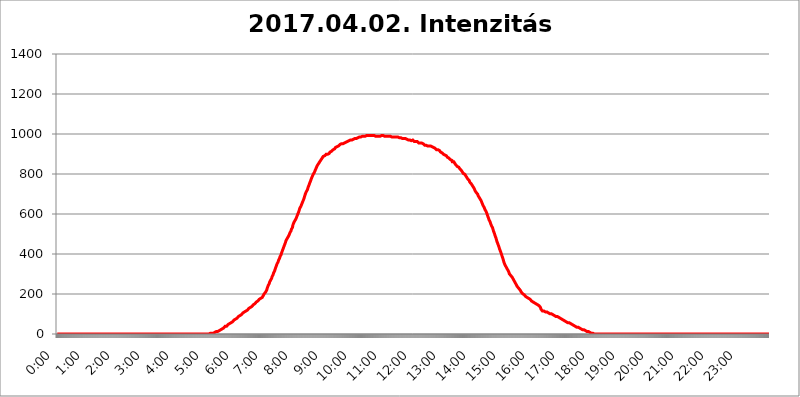
| Category | 2017.04.02. Intenzitás [W/m^2] |
|---|---|
| 0.0 | 0 |
| 0.0006944444444444445 | 0 |
| 0.001388888888888889 | 0 |
| 0.0020833333333333333 | 0 |
| 0.002777777777777778 | 0 |
| 0.003472222222222222 | 0 |
| 0.004166666666666667 | 0 |
| 0.004861111111111111 | 0 |
| 0.005555555555555556 | 0 |
| 0.0062499999999999995 | 0 |
| 0.006944444444444444 | 0 |
| 0.007638888888888889 | 0 |
| 0.008333333333333333 | 0 |
| 0.009027777777777779 | 0 |
| 0.009722222222222222 | 0 |
| 0.010416666666666666 | 0 |
| 0.011111111111111112 | 0 |
| 0.011805555555555555 | 0 |
| 0.012499999999999999 | 0 |
| 0.013194444444444444 | 0 |
| 0.013888888888888888 | 0 |
| 0.014583333333333332 | 0 |
| 0.015277777777777777 | 0 |
| 0.015972222222222224 | 0 |
| 0.016666666666666666 | 0 |
| 0.017361111111111112 | 0 |
| 0.018055555555555557 | 0 |
| 0.01875 | 0 |
| 0.019444444444444445 | 0 |
| 0.02013888888888889 | 0 |
| 0.020833333333333332 | 0 |
| 0.02152777777777778 | 0 |
| 0.022222222222222223 | 0 |
| 0.02291666666666667 | 0 |
| 0.02361111111111111 | 0 |
| 0.024305555555555556 | 0 |
| 0.024999999999999998 | 0 |
| 0.025694444444444447 | 0 |
| 0.02638888888888889 | 0 |
| 0.027083333333333334 | 0 |
| 0.027777777777777776 | 0 |
| 0.02847222222222222 | 0 |
| 0.029166666666666664 | 0 |
| 0.029861111111111113 | 0 |
| 0.030555555555555555 | 0 |
| 0.03125 | 0 |
| 0.03194444444444445 | 0 |
| 0.03263888888888889 | 0 |
| 0.03333333333333333 | 0 |
| 0.034027777777777775 | 0 |
| 0.034722222222222224 | 0 |
| 0.035416666666666666 | 0 |
| 0.036111111111111115 | 0 |
| 0.03680555555555556 | 0 |
| 0.0375 | 0 |
| 0.03819444444444444 | 0 |
| 0.03888888888888889 | 0 |
| 0.03958333333333333 | 0 |
| 0.04027777777777778 | 0 |
| 0.04097222222222222 | 0 |
| 0.041666666666666664 | 0 |
| 0.042361111111111106 | 0 |
| 0.04305555555555556 | 0 |
| 0.043750000000000004 | 0 |
| 0.044444444444444446 | 0 |
| 0.04513888888888889 | 0 |
| 0.04583333333333334 | 0 |
| 0.04652777777777778 | 0 |
| 0.04722222222222222 | 0 |
| 0.04791666666666666 | 0 |
| 0.04861111111111111 | 0 |
| 0.049305555555555554 | 0 |
| 0.049999999999999996 | 0 |
| 0.05069444444444445 | 0 |
| 0.051388888888888894 | 0 |
| 0.052083333333333336 | 0 |
| 0.05277777777777778 | 0 |
| 0.05347222222222222 | 0 |
| 0.05416666666666667 | 0 |
| 0.05486111111111111 | 0 |
| 0.05555555555555555 | 0 |
| 0.05625 | 0 |
| 0.05694444444444444 | 0 |
| 0.057638888888888885 | 0 |
| 0.05833333333333333 | 0 |
| 0.05902777777777778 | 0 |
| 0.059722222222222225 | 0 |
| 0.06041666666666667 | 0 |
| 0.061111111111111116 | 0 |
| 0.06180555555555556 | 0 |
| 0.0625 | 0 |
| 0.06319444444444444 | 0 |
| 0.06388888888888888 | 0 |
| 0.06458333333333334 | 0 |
| 0.06527777777777778 | 0 |
| 0.06597222222222222 | 0 |
| 0.06666666666666667 | 0 |
| 0.06736111111111111 | 0 |
| 0.06805555555555555 | 0 |
| 0.06874999999999999 | 0 |
| 0.06944444444444443 | 0 |
| 0.07013888888888889 | 0 |
| 0.07083333333333333 | 0 |
| 0.07152777777777779 | 0 |
| 0.07222222222222223 | 0 |
| 0.07291666666666667 | 0 |
| 0.07361111111111111 | 0 |
| 0.07430555555555556 | 0 |
| 0.075 | 0 |
| 0.07569444444444444 | 0 |
| 0.0763888888888889 | 0 |
| 0.07708333333333334 | 0 |
| 0.07777777777777778 | 0 |
| 0.07847222222222222 | 0 |
| 0.07916666666666666 | 0 |
| 0.0798611111111111 | 0 |
| 0.08055555555555556 | 0 |
| 0.08125 | 0 |
| 0.08194444444444444 | 0 |
| 0.08263888888888889 | 0 |
| 0.08333333333333333 | 0 |
| 0.08402777777777777 | 0 |
| 0.08472222222222221 | 0 |
| 0.08541666666666665 | 0 |
| 0.08611111111111112 | 0 |
| 0.08680555555555557 | 0 |
| 0.08750000000000001 | 0 |
| 0.08819444444444445 | 0 |
| 0.08888888888888889 | 0 |
| 0.08958333333333333 | 0 |
| 0.09027777777777778 | 0 |
| 0.09097222222222222 | 0 |
| 0.09166666666666667 | 0 |
| 0.09236111111111112 | 0 |
| 0.09305555555555556 | 0 |
| 0.09375 | 0 |
| 0.09444444444444444 | 0 |
| 0.09513888888888888 | 0 |
| 0.09583333333333333 | 0 |
| 0.09652777777777777 | 0 |
| 0.09722222222222222 | 0 |
| 0.09791666666666667 | 0 |
| 0.09861111111111111 | 0 |
| 0.09930555555555555 | 0 |
| 0.09999999999999999 | 0 |
| 0.10069444444444443 | 0 |
| 0.1013888888888889 | 0 |
| 0.10208333333333335 | 0 |
| 0.10277777777777779 | 0 |
| 0.10347222222222223 | 0 |
| 0.10416666666666667 | 0 |
| 0.10486111111111111 | 0 |
| 0.10555555555555556 | 0 |
| 0.10625 | 0 |
| 0.10694444444444444 | 0 |
| 0.1076388888888889 | 0 |
| 0.10833333333333334 | 0 |
| 0.10902777777777778 | 0 |
| 0.10972222222222222 | 0 |
| 0.1111111111111111 | 0 |
| 0.11180555555555556 | 0 |
| 0.11180555555555556 | 0 |
| 0.1125 | 0 |
| 0.11319444444444444 | 0 |
| 0.11388888888888889 | 0 |
| 0.11458333333333333 | 0 |
| 0.11527777777777777 | 0 |
| 0.11597222222222221 | 0 |
| 0.11666666666666665 | 0 |
| 0.1173611111111111 | 0 |
| 0.11805555555555557 | 0 |
| 0.11944444444444445 | 0 |
| 0.12013888888888889 | 0 |
| 0.12083333333333333 | 0 |
| 0.12152777777777778 | 0 |
| 0.12222222222222223 | 0 |
| 0.12291666666666667 | 0 |
| 0.12291666666666667 | 0 |
| 0.12361111111111112 | 0 |
| 0.12430555555555556 | 0 |
| 0.125 | 0 |
| 0.12569444444444444 | 0 |
| 0.12638888888888888 | 0 |
| 0.12708333333333333 | 0 |
| 0.16875 | 0 |
| 0.12847222222222224 | 0 |
| 0.12916666666666668 | 0 |
| 0.12986111111111112 | 0 |
| 0.13055555555555556 | 0 |
| 0.13125 | 0 |
| 0.13194444444444445 | 0 |
| 0.1326388888888889 | 0 |
| 0.13333333333333333 | 0 |
| 0.13402777777777777 | 0 |
| 0.13402777777777777 | 0 |
| 0.13472222222222222 | 0 |
| 0.13541666666666666 | 0 |
| 0.1361111111111111 | 0 |
| 0.13749999999999998 | 0 |
| 0.13819444444444443 | 0 |
| 0.1388888888888889 | 0 |
| 0.13958333333333334 | 0 |
| 0.14027777777777778 | 0 |
| 0.14097222222222222 | 0 |
| 0.14166666666666666 | 0 |
| 0.1423611111111111 | 0 |
| 0.14305555555555557 | 0 |
| 0.14375000000000002 | 0 |
| 0.14444444444444446 | 0 |
| 0.1451388888888889 | 0 |
| 0.1451388888888889 | 0 |
| 0.14652777777777778 | 0 |
| 0.14722222222222223 | 0 |
| 0.14791666666666667 | 0 |
| 0.1486111111111111 | 0 |
| 0.14930555555555555 | 0 |
| 0.15 | 0 |
| 0.15069444444444444 | 0 |
| 0.15138888888888888 | 0 |
| 0.15208333333333332 | 0 |
| 0.15277777777777776 | 0 |
| 0.15347222222222223 | 0 |
| 0.15416666666666667 | 0 |
| 0.15486111111111112 | 0 |
| 0.15555555555555556 | 0 |
| 0.15625 | 0 |
| 0.15694444444444444 | 0 |
| 0.15763888888888888 | 0 |
| 0.15833333333333333 | 0 |
| 0.15902777777777777 | 0 |
| 0.15972222222222224 | 0 |
| 0.16041666666666668 | 0 |
| 0.16111111111111112 | 0 |
| 0.16180555555555556 | 0 |
| 0.1625 | 0 |
| 0.16319444444444445 | 0 |
| 0.1638888888888889 | 0 |
| 0.16458333333333333 | 0 |
| 0.16527777777777777 | 0 |
| 0.16597222222222222 | 0 |
| 0.16666666666666666 | 0 |
| 0.1673611111111111 | 0 |
| 0.16805555555555554 | 0 |
| 0.16874999999999998 | 0 |
| 0.16944444444444443 | 0 |
| 0.17013888888888887 | 0 |
| 0.1708333333333333 | 0 |
| 0.17152777777777775 | 0 |
| 0.17222222222222225 | 0 |
| 0.1729166666666667 | 0 |
| 0.17361111111111113 | 0 |
| 0.17430555555555557 | 0 |
| 0.17500000000000002 | 0 |
| 0.17569444444444446 | 0 |
| 0.1763888888888889 | 0 |
| 0.17708333333333334 | 0 |
| 0.17777777777777778 | 0 |
| 0.17847222222222223 | 0 |
| 0.17916666666666667 | 0 |
| 0.1798611111111111 | 0 |
| 0.18055555555555555 | 0 |
| 0.18125 | 0 |
| 0.18194444444444444 | 0 |
| 0.1826388888888889 | 0 |
| 0.18333333333333335 | 0 |
| 0.1840277777777778 | 0 |
| 0.18472222222222223 | 0 |
| 0.18541666666666667 | 0 |
| 0.18611111111111112 | 0 |
| 0.18680555555555556 | 0 |
| 0.1875 | 0 |
| 0.18819444444444444 | 0 |
| 0.18888888888888888 | 0 |
| 0.18958333333333333 | 0 |
| 0.19027777777777777 | 0 |
| 0.1909722222222222 | 0 |
| 0.19166666666666665 | 0 |
| 0.19236111111111112 | 0 |
| 0.19305555555555554 | 0 |
| 0.19375 | 0 |
| 0.19444444444444445 | 0 |
| 0.1951388888888889 | 0 |
| 0.19583333333333333 | 0 |
| 0.19652777777777777 | 0 |
| 0.19722222222222222 | 0 |
| 0.19791666666666666 | 0 |
| 0.1986111111111111 | 0 |
| 0.19930555555555554 | 0 |
| 0.19999999999999998 | 0 |
| 0.20069444444444443 | 0 |
| 0.20138888888888887 | 0 |
| 0.2020833333333333 | 0 |
| 0.2027777777777778 | 0 |
| 0.2034722222222222 | 0 |
| 0.2041666666666667 | 0 |
| 0.20486111111111113 | 0 |
| 0.20555555555555557 | 0 |
| 0.20625000000000002 | 0 |
| 0.20694444444444446 | 0 |
| 0.2076388888888889 | 0 |
| 0.20833333333333334 | 0 |
| 0.20902777777777778 | 0 |
| 0.20972222222222223 | 0 |
| 0.21041666666666667 | 0 |
| 0.2111111111111111 | 0 |
| 0.21180555555555555 | 0 |
| 0.2125 | 0 |
| 0.21319444444444444 | 0 |
| 0.2138888888888889 | 0 |
| 0.21458333333333335 | 3.525 |
| 0.2152777777777778 | 3.525 |
| 0.21597222222222223 | 3.525 |
| 0.21666666666666667 | 3.525 |
| 0.21736111111111112 | 3.525 |
| 0.21805555555555556 | 3.525 |
| 0.21875 | 3.525 |
| 0.21944444444444444 | 3.525 |
| 0.22013888888888888 | 3.525 |
| 0.22083333333333333 | 7.887 |
| 0.22152777777777777 | 7.887 |
| 0.2222222222222222 | 12.257 |
| 0.22291666666666665 | 12.257 |
| 0.2236111111111111 | 12.257 |
| 0.22430555555555556 | 12.257 |
| 0.225 | 12.257 |
| 0.22569444444444445 | 12.257 |
| 0.2263888888888889 | 16.636 |
| 0.22708333333333333 | 16.636 |
| 0.22777777777777777 | 21.024 |
| 0.22847222222222222 | 21.024 |
| 0.22916666666666666 | 21.024 |
| 0.2298611111111111 | 21.024 |
| 0.23055555555555554 | 25.419 |
| 0.23124999999999998 | 25.419 |
| 0.23194444444444443 | 29.823 |
| 0.23263888888888887 | 29.823 |
| 0.2333333333333333 | 29.823 |
| 0.2340277777777778 | 34.234 |
| 0.2347222222222222 | 34.234 |
| 0.2354166666666667 | 38.653 |
| 0.23611111111111113 | 38.653 |
| 0.23680555555555557 | 38.653 |
| 0.23750000000000002 | 38.653 |
| 0.23819444444444446 | 43.079 |
| 0.2388888888888889 | 43.079 |
| 0.23958333333333334 | 47.511 |
| 0.24027777777777778 | 47.511 |
| 0.24097222222222223 | 47.511 |
| 0.24166666666666667 | 51.951 |
| 0.2423611111111111 | 51.951 |
| 0.24305555555555555 | 56.398 |
| 0.24375 | 56.398 |
| 0.24444444444444446 | 60.85 |
| 0.24513888888888888 | 60.85 |
| 0.24583333333333335 | 60.85 |
| 0.2465277777777778 | 65.31 |
| 0.24722222222222223 | 65.31 |
| 0.24791666666666667 | 69.775 |
| 0.24861111111111112 | 74.246 |
| 0.24930555555555556 | 74.246 |
| 0.25 | 74.246 |
| 0.25069444444444444 | 74.246 |
| 0.2513888888888889 | 78.722 |
| 0.2520833333333333 | 78.722 |
| 0.25277777777777777 | 83.205 |
| 0.2534722222222222 | 83.205 |
| 0.25416666666666665 | 87.692 |
| 0.2548611111111111 | 87.692 |
| 0.2555555555555556 | 92.184 |
| 0.25625000000000003 | 92.184 |
| 0.2569444444444445 | 96.682 |
| 0.2576388888888889 | 96.682 |
| 0.25833333333333336 | 96.682 |
| 0.2590277777777778 | 101.184 |
| 0.25972222222222224 | 101.184 |
| 0.2604166666666667 | 105.69 |
| 0.2611111111111111 | 105.69 |
| 0.26180555555555557 | 105.69 |
| 0.2625 | 110.201 |
| 0.26319444444444445 | 110.201 |
| 0.2638888888888889 | 110.201 |
| 0.26458333333333334 | 114.716 |
| 0.2652777777777778 | 119.235 |
| 0.2659722222222222 | 119.235 |
| 0.26666666666666666 | 119.235 |
| 0.2673611111111111 | 123.758 |
| 0.26805555555555555 | 123.758 |
| 0.26875 | 128.284 |
| 0.26944444444444443 | 128.284 |
| 0.2701388888888889 | 132.814 |
| 0.2708333333333333 | 132.814 |
| 0.27152777777777776 | 132.814 |
| 0.2722222222222222 | 137.347 |
| 0.27291666666666664 | 137.347 |
| 0.2736111111111111 | 141.884 |
| 0.2743055555555555 | 141.884 |
| 0.27499999999999997 | 146.423 |
| 0.27569444444444446 | 146.423 |
| 0.27638888888888885 | 150.964 |
| 0.27708333333333335 | 150.964 |
| 0.2777777777777778 | 155.509 |
| 0.27847222222222223 | 155.509 |
| 0.2791666666666667 | 160.056 |
| 0.2798611111111111 | 160.056 |
| 0.28055555555555556 | 164.605 |
| 0.28125 | 164.605 |
| 0.28194444444444444 | 164.605 |
| 0.2826388888888889 | 169.156 |
| 0.2833333333333333 | 173.709 |
| 0.28402777777777777 | 173.709 |
| 0.2847222222222222 | 173.709 |
| 0.28541666666666665 | 178.264 |
| 0.28611111111111115 | 178.264 |
| 0.28680555555555554 | 182.82 |
| 0.28750000000000003 | 182.82 |
| 0.2881944444444445 | 187.378 |
| 0.2888888888888889 | 191.937 |
| 0.28958333333333336 | 196.497 |
| 0.2902777777777778 | 201.058 |
| 0.29097222222222224 | 201.058 |
| 0.2916666666666667 | 205.62 |
| 0.2923611111111111 | 210.182 |
| 0.29305555555555557 | 214.746 |
| 0.29375 | 219.309 |
| 0.29444444444444445 | 228.436 |
| 0.2951388888888889 | 233 |
| 0.29583333333333334 | 242.127 |
| 0.2965277777777778 | 246.689 |
| 0.2972222222222222 | 251.251 |
| 0.29791666666666666 | 260.373 |
| 0.2986111111111111 | 264.932 |
| 0.29930555555555555 | 269.49 |
| 0.3 | 274.047 |
| 0.30069444444444443 | 278.603 |
| 0.3013888888888889 | 287.709 |
| 0.3020833333333333 | 292.259 |
| 0.30277777777777776 | 296.808 |
| 0.3034722222222222 | 305.898 |
| 0.30416666666666664 | 310.44 |
| 0.3048611111111111 | 314.98 |
| 0.3055555555555555 | 324.052 |
| 0.30624999999999997 | 328.584 |
| 0.3069444444444444 | 337.639 |
| 0.3076388888888889 | 342.162 |
| 0.30833333333333335 | 351.198 |
| 0.3090277777777778 | 355.712 |
| 0.30972222222222223 | 360.221 |
| 0.3104166666666667 | 369.23 |
| 0.3111111111111111 | 373.729 |
| 0.31180555555555556 | 378.224 |
| 0.3125 | 387.202 |
| 0.31319444444444444 | 391.685 |
| 0.3138888888888889 | 396.164 |
| 0.3145833333333333 | 405.108 |
| 0.31527777777777777 | 409.574 |
| 0.3159722222222222 | 418.492 |
| 0.31666666666666665 | 422.943 |
| 0.31736111111111115 | 431.833 |
| 0.31805555555555554 | 436.27 |
| 0.31875000000000003 | 445.129 |
| 0.3194444444444445 | 449.551 |
| 0.3201388888888889 | 458.38 |
| 0.32083333333333336 | 467.187 |
| 0.3215277777777778 | 471.582 |
| 0.32222222222222224 | 475.972 |
| 0.3229166666666667 | 480.356 |
| 0.3236111111111111 | 484.735 |
| 0.32430555555555557 | 489.108 |
| 0.325 | 493.475 |
| 0.32569444444444445 | 497.836 |
| 0.3263888888888889 | 506.542 |
| 0.32708333333333334 | 510.885 |
| 0.3277777777777778 | 515.223 |
| 0.3284722222222222 | 523.88 |
| 0.32916666666666666 | 528.2 |
| 0.3298611111111111 | 532.513 |
| 0.33055555555555555 | 545.416 |
| 0.33125 | 549.704 |
| 0.33194444444444443 | 558.261 |
| 0.3326388888888889 | 562.53 |
| 0.3333333333333333 | 566.793 |
| 0.3340277777777778 | 571.049 |
| 0.3347222222222222 | 575.299 |
| 0.3354166666666667 | 579.542 |
| 0.3361111111111111 | 588.009 |
| 0.3368055555555556 | 592.233 |
| 0.33749999999999997 | 600.661 |
| 0.33819444444444446 | 604.864 |
| 0.33888888888888885 | 613.252 |
| 0.33958333333333335 | 621.613 |
| 0.34027777777777773 | 629.948 |
| 0.34097222222222223 | 634.105 |
| 0.3416666666666666 | 638.256 |
| 0.3423611111111111 | 642.4 |
| 0.3430555555555555 | 650.667 |
| 0.34375 | 654.791 |
| 0.3444444444444445 | 663.019 |
| 0.3451388888888889 | 667.123 |
| 0.3458333333333334 | 675.311 |
| 0.34652777777777777 | 683.473 |
| 0.34722222222222227 | 687.544 |
| 0.34791666666666665 | 699.717 |
| 0.34861111111111115 | 703.762 |
| 0.34930555555555554 | 711.832 |
| 0.35000000000000003 | 715.858 |
| 0.3506944444444444 | 719.877 |
| 0.3513888888888889 | 727.896 |
| 0.3520833333333333 | 735.89 |
| 0.3527777777777778 | 739.877 |
| 0.3534722222222222 | 747.834 |
| 0.3541666666666667 | 755.766 |
| 0.3548611111111111 | 759.723 |
| 0.35555555555555557 | 767.62 |
| 0.35625 | 775.492 |
| 0.35694444444444445 | 779.42 |
| 0.3576388888888889 | 787.258 |
| 0.35833333333333334 | 791.169 |
| 0.3590277777777778 | 798.974 |
| 0.3597222222222222 | 802.868 |
| 0.36041666666666666 | 806.757 |
| 0.3611111111111111 | 810.641 |
| 0.36180555555555555 | 818.392 |
| 0.3625 | 822.26 |
| 0.36319444444444443 | 829.981 |
| 0.3638888888888889 | 833.834 |
| 0.3645833333333333 | 841.526 |
| 0.3652777777777778 | 845.365 |
| 0.3659722222222222 | 849.199 |
| 0.3666666666666667 | 853.029 |
| 0.3673611111111111 | 856.855 |
| 0.3680555555555556 | 860.676 |
| 0.36874999999999997 | 864.493 |
| 0.36944444444444446 | 868.305 |
| 0.37013888888888885 | 872.114 |
| 0.37083333333333335 | 875.918 |
| 0.37152777777777773 | 879.719 |
| 0.37222222222222223 | 883.516 |
| 0.3729166666666666 | 887.309 |
| 0.3736111111111111 | 887.309 |
| 0.3743055555555555 | 887.309 |
| 0.375 | 891.099 |
| 0.3756944444444445 | 891.099 |
| 0.3763888888888889 | 894.885 |
| 0.3770833333333334 | 898.668 |
| 0.37777777777777777 | 898.668 |
| 0.37847222222222227 | 898.668 |
| 0.37916666666666665 | 898.668 |
| 0.37986111111111115 | 902.447 |
| 0.38055555555555554 | 902.447 |
| 0.38125000000000003 | 902.447 |
| 0.3819444444444444 | 906.223 |
| 0.3826388888888889 | 909.996 |
| 0.3833333333333333 | 909.996 |
| 0.3840277777777778 | 913.766 |
| 0.3847222222222222 | 913.766 |
| 0.3854166666666667 | 917.534 |
| 0.3861111111111111 | 917.534 |
| 0.38680555555555557 | 921.298 |
| 0.3875 | 921.298 |
| 0.38819444444444445 | 925.06 |
| 0.3888888888888889 | 925.06 |
| 0.38958333333333334 | 928.819 |
| 0.3902777777777778 | 932.576 |
| 0.3909722222222222 | 932.576 |
| 0.39166666666666666 | 932.576 |
| 0.3923611111111111 | 936.33 |
| 0.39305555555555555 | 936.33 |
| 0.39375 | 940.082 |
| 0.39444444444444443 | 940.082 |
| 0.3951388888888889 | 943.832 |
| 0.3958333333333333 | 943.832 |
| 0.3965277777777778 | 947.58 |
| 0.3972222222222222 | 947.58 |
| 0.3979166666666667 | 947.58 |
| 0.3986111111111111 | 951.327 |
| 0.3993055555555556 | 951.327 |
| 0.39999999999999997 | 951.327 |
| 0.40069444444444446 | 951.327 |
| 0.40138888888888885 | 955.071 |
| 0.40208333333333335 | 955.071 |
| 0.40277777777777773 | 955.071 |
| 0.40347222222222223 | 958.814 |
| 0.4041666666666666 | 958.814 |
| 0.4048611111111111 | 958.814 |
| 0.4055555555555555 | 962.555 |
| 0.40625 | 962.555 |
| 0.4069444444444445 | 962.555 |
| 0.4076388888888889 | 962.555 |
| 0.4083333333333334 | 966.295 |
| 0.40902777777777777 | 966.295 |
| 0.40972222222222227 | 966.295 |
| 0.41041666666666665 | 970.034 |
| 0.41111111111111115 | 970.034 |
| 0.41180555555555554 | 970.034 |
| 0.41250000000000003 | 970.034 |
| 0.4131944444444444 | 970.034 |
| 0.4138888888888889 | 973.772 |
| 0.4145833333333333 | 973.772 |
| 0.4152777777777778 | 973.772 |
| 0.4159722222222222 | 973.772 |
| 0.4166666666666667 | 973.772 |
| 0.4173611111111111 | 977.508 |
| 0.41805555555555557 | 977.508 |
| 0.41875 | 977.508 |
| 0.41944444444444445 | 977.508 |
| 0.4201388888888889 | 981.244 |
| 0.42083333333333334 | 981.244 |
| 0.4215277777777778 | 981.244 |
| 0.4222222222222222 | 981.244 |
| 0.42291666666666666 | 981.244 |
| 0.4236111111111111 | 984.98 |
| 0.42430555555555555 | 984.98 |
| 0.425 | 984.98 |
| 0.42569444444444443 | 984.98 |
| 0.4263888888888889 | 984.98 |
| 0.4270833333333333 | 984.98 |
| 0.4277777777777778 | 988.714 |
| 0.4284722222222222 | 988.714 |
| 0.4291666666666667 | 988.714 |
| 0.4298611111111111 | 988.714 |
| 0.4305555555555556 | 988.714 |
| 0.43124999999999997 | 984.98 |
| 0.43194444444444446 | 988.714 |
| 0.43263888888888885 | 988.714 |
| 0.43333333333333335 | 992.448 |
| 0.43402777777777773 | 992.448 |
| 0.43472222222222223 | 992.448 |
| 0.4354166666666666 | 992.448 |
| 0.4361111111111111 | 992.448 |
| 0.4368055555555555 | 992.448 |
| 0.4375 | 988.714 |
| 0.4381944444444445 | 992.448 |
| 0.4388888888888889 | 992.448 |
| 0.4395833333333334 | 992.448 |
| 0.44027777777777777 | 992.448 |
| 0.44097222222222227 | 992.448 |
| 0.44166666666666665 | 992.448 |
| 0.44236111111111115 | 992.448 |
| 0.44305555555555554 | 992.448 |
| 0.44375000000000003 | 992.448 |
| 0.4444444444444444 | 992.448 |
| 0.4451388888888889 | 988.714 |
| 0.4458333333333333 | 988.714 |
| 0.4465277777777778 | 988.714 |
| 0.4472222222222222 | 988.714 |
| 0.4479166666666667 | 988.714 |
| 0.4486111111111111 | 988.714 |
| 0.44930555555555557 | 988.714 |
| 0.45 | 992.448 |
| 0.45069444444444445 | 988.714 |
| 0.4513888888888889 | 988.714 |
| 0.45208333333333334 | 988.714 |
| 0.4527777777777778 | 988.714 |
| 0.4534722222222222 | 988.714 |
| 0.45416666666666666 | 988.714 |
| 0.4548611111111111 | 992.448 |
| 0.45555555555555555 | 988.714 |
| 0.45625 | 992.448 |
| 0.45694444444444443 | 992.448 |
| 0.4576388888888889 | 988.714 |
| 0.4583333333333333 | 988.714 |
| 0.4590277777777778 | 988.714 |
| 0.4597222222222222 | 988.714 |
| 0.4604166666666667 | 988.714 |
| 0.4611111111111111 | 988.714 |
| 0.4618055555555556 | 988.714 |
| 0.46249999999999997 | 988.714 |
| 0.46319444444444446 | 988.714 |
| 0.46388888888888885 | 988.714 |
| 0.46458333333333335 | 988.714 |
| 0.46527777777777773 | 988.714 |
| 0.46597222222222223 | 988.714 |
| 0.4666666666666666 | 988.714 |
| 0.4673611111111111 | 988.714 |
| 0.4680555555555555 | 988.714 |
| 0.46875 | 988.714 |
| 0.4694444444444445 | 984.98 |
| 0.4701388888888889 | 984.98 |
| 0.4708333333333334 | 984.98 |
| 0.47152777777777777 | 984.98 |
| 0.47222222222222227 | 984.98 |
| 0.47291666666666665 | 984.98 |
| 0.47361111111111115 | 984.98 |
| 0.47430555555555554 | 984.98 |
| 0.47500000000000003 | 984.98 |
| 0.4756944444444444 | 984.98 |
| 0.4763888888888889 | 984.98 |
| 0.4770833333333333 | 984.98 |
| 0.4777777777777778 | 984.98 |
| 0.4784722222222222 | 981.244 |
| 0.4791666666666667 | 981.244 |
| 0.4798611111111111 | 981.244 |
| 0.48055555555555557 | 981.244 |
| 0.48125 | 981.244 |
| 0.48194444444444445 | 981.244 |
| 0.4826388888888889 | 981.244 |
| 0.48333333333333334 | 981.244 |
| 0.4840277777777778 | 977.508 |
| 0.4847222222222222 | 977.508 |
| 0.48541666666666666 | 977.508 |
| 0.4861111111111111 | 977.508 |
| 0.48680555555555555 | 977.508 |
| 0.4875 | 977.508 |
| 0.48819444444444443 | 977.508 |
| 0.4888888888888889 | 977.508 |
| 0.4895833333333333 | 973.772 |
| 0.4902777777777778 | 973.772 |
| 0.4909722222222222 | 970.034 |
| 0.4916666666666667 | 970.034 |
| 0.4923611111111111 | 970.034 |
| 0.4930555555555556 | 970.034 |
| 0.49374999999999997 | 970.034 |
| 0.49444444444444446 | 970.034 |
| 0.49513888888888885 | 970.034 |
| 0.49583333333333335 | 970.034 |
| 0.49652777777777773 | 966.295 |
| 0.49722222222222223 | 970.034 |
| 0.4979166666666666 | 970.034 |
| 0.4986111111111111 | 970.034 |
| 0.4993055555555555 | 970.034 |
| 0.5 | 966.295 |
| 0.5006944444444444 | 962.555 |
| 0.5013888888888889 | 962.555 |
| 0.5020833333333333 | 962.555 |
| 0.5027777777777778 | 962.555 |
| 0.5034722222222222 | 958.814 |
| 0.5041666666666667 | 958.814 |
| 0.5048611111111111 | 962.555 |
| 0.5055555555555555 | 958.814 |
| 0.50625 | 958.814 |
| 0.5069444444444444 | 955.071 |
| 0.5076388888888889 | 955.071 |
| 0.5083333333333333 | 955.071 |
| 0.5090277777777777 | 955.071 |
| 0.5097222222222222 | 955.071 |
| 0.5104166666666666 | 955.071 |
| 0.5111111111111112 | 955.071 |
| 0.5118055555555555 | 955.071 |
| 0.5125000000000001 | 951.327 |
| 0.5131944444444444 | 951.327 |
| 0.513888888888889 | 947.58 |
| 0.5145833333333333 | 947.58 |
| 0.5152777777777778 | 943.832 |
| 0.5159722222222222 | 943.832 |
| 0.5166666666666667 | 943.832 |
| 0.517361111111111 | 943.832 |
| 0.5180555555555556 | 940.082 |
| 0.5187499999999999 | 940.082 |
| 0.5194444444444445 | 940.082 |
| 0.5201388888888888 | 940.082 |
| 0.5208333333333334 | 940.082 |
| 0.5215277777777778 | 940.082 |
| 0.5222222222222223 | 940.082 |
| 0.5229166666666667 | 940.082 |
| 0.5236111111111111 | 940.082 |
| 0.5243055555555556 | 940.082 |
| 0.525 | 936.33 |
| 0.5256944444444445 | 936.33 |
| 0.5263888888888889 | 932.576 |
| 0.5270833333333333 | 932.576 |
| 0.5277777777777778 | 932.576 |
| 0.5284722222222222 | 932.576 |
| 0.5291666666666667 | 932.576 |
| 0.5298611111111111 | 928.819 |
| 0.5305555555555556 | 925.06 |
| 0.53125 | 925.06 |
| 0.5319444444444444 | 921.298 |
| 0.5326388888888889 | 921.298 |
| 0.5333333333333333 | 921.298 |
| 0.5340277777777778 | 921.298 |
| 0.5347222222222222 | 917.534 |
| 0.5354166666666667 | 917.534 |
| 0.5361111111111111 | 917.534 |
| 0.5368055555555555 | 913.766 |
| 0.5375 | 909.996 |
| 0.5381944444444444 | 906.223 |
| 0.5388888888888889 | 906.223 |
| 0.5395833333333333 | 906.223 |
| 0.5402777777777777 | 902.447 |
| 0.5409722222222222 | 902.447 |
| 0.5416666666666666 | 898.668 |
| 0.5423611111111112 | 894.885 |
| 0.5430555555555555 | 894.885 |
| 0.5437500000000001 | 894.885 |
| 0.5444444444444444 | 891.099 |
| 0.545138888888889 | 891.099 |
| 0.5458333333333333 | 891.099 |
| 0.5465277777777778 | 887.309 |
| 0.5472222222222222 | 883.516 |
| 0.5479166666666667 | 883.516 |
| 0.548611111111111 | 879.719 |
| 0.5493055555555556 | 879.719 |
| 0.5499999999999999 | 879.719 |
| 0.5506944444444445 | 875.918 |
| 0.5513888888888888 | 872.114 |
| 0.5520833333333334 | 872.114 |
| 0.5527777777777778 | 868.305 |
| 0.5534722222222223 | 868.305 |
| 0.5541666666666667 | 860.676 |
| 0.5548611111111111 | 860.676 |
| 0.5555555555555556 | 860.676 |
| 0.55625 | 860.676 |
| 0.5569444444444445 | 856.855 |
| 0.5576388888888889 | 853.029 |
| 0.5583333333333333 | 849.199 |
| 0.5590277777777778 | 845.365 |
| 0.5597222222222222 | 841.526 |
| 0.5604166666666667 | 841.526 |
| 0.5611111111111111 | 837.682 |
| 0.5618055555555556 | 837.682 |
| 0.5625 | 833.834 |
| 0.5631944444444444 | 833.834 |
| 0.5638888888888889 | 829.981 |
| 0.5645833333333333 | 826.123 |
| 0.5652777777777778 | 826.123 |
| 0.5659722222222222 | 822.26 |
| 0.5666666666666667 | 818.392 |
| 0.5673611111111111 | 814.519 |
| 0.5680555555555555 | 810.641 |
| 0.56875 | 806.757 |
| 0.5694444444444444 | 802.868 |
| 0.5701388888888889 | 802.868 |
| 0.5708333333333333 | 802.868 |
| 0.5715277777777777 | 798.974 |
| 0.5722222222222222 | 795.074 |
| 0.5729166666666666 | 791.169 |
| 0.5736111111111112 | 787.258 |
| 0.5743055555555555 | 783.342 |
| 0.5750000000000001 | 779.42 |
| 0.5756944444444444 | 775.492 |
| 0.576388888888889 | 775.492 |
| 0.5770833333333333 | 771.559 |
| 0.5777777777777778 | 767.62 |
| 0.5784722222222222 | 759.723 |
| 0.5791666666666667 | 759.723 |
| 0.579861111111111 | 755.766 |
| 0.5805555555555556 | 751.803 |
| 0.5812499999999999 | 747.834 |
| 0.5819444444444445 | 743.859 |
| 0.5826388888888888 | 743.859 |
| 0.5833333333333334 | 735.89 |
| 0.5840277777777778 | 731.896 |
| 0.5847222222222223 | 727.896 |
| 0.5854166666666667 | 723.889 |
| 0.5861111111111111 | 715.858 |
| 0.5868055555555556 | 711.832 |
| 0.5875 | 707.8 |
| 0.5881944444444445 | 703.762 |
| 0.5888888888888889 | 703.762 |
| 0.5895833333333333 | 699.717 |
| 0.5902777777777778 | 691.608 |
| 0.5909722222222222 | 687.544 |
| 0.5916666666666667 | 683.473 |
| 0.5923611111111111 | 679.395 |
| 0.5930555555555556 | 675.311 |
| 0.59375 | 671.22 |
| 0.5944444444444444 | 667.123 |
| 0.5951388888888889 | 663.019 |
| 0.5958333333333333 | 654.791 |
| 0.5965277777777778 | 650.667 |
| 0.5972222222222222 | 642.4 |
| 0.5979166666666667 | 642.4 |
| 0.5986111111111111 | 634.105 |
| 0.5993055555555555 | 629.948 |
| 0.6 | 621.613 |
| 0.6006944444444444 | 617.436 |
| 0.6013888888888889 | 613.252 |
| 0.6020833333333333 | 609.062 |
| 0.6027777777777777 | 600.661 |
| 0.6034722222222222 | 592.233 |
| 0.6041666666666666 | 588.009 |
| 0.6048611111111112 | 579.542 |
| 0.6055555555555555 | 571.049 |
| 0.6062500000000001 | 566.793 |
| 0.6069444444444444 | 562.53 |
| 0.607638888888889 | 553.986 |
| 0.6083333333333333 | 549.704 |
| 0.6090277777777778 | 541.121 |
| 0.6097222222222222 | 536.82 |
| 0.6104166666666667 | 532.513 |
| 0.611111111111111 | 523.88 |
| 0.6118055555555556 | 515.223 |
| 0.6124999999999999 | 510.885 |
| 0.6131944444444445 | 502.192 |
| 0.6138888888888888 | 493.475 |
| 0.6145833333333334 | 489.108 |
| 0.6152777777777778 | 480.356 |
| 0.6159722222222223 | 471.582 |
| 0.6166666666666667 | 462.786 |
| 0.6173611111111111 | 458.38 |
| 0.6180555555555556 | 449.551 |
| 0.61875 | 445.129 |
| 0.6194444444444445 | 436.27 |
| 0.6201388888888889 | 427.39 |
| 0.6208333333333333 | 422.943 |
| 0.6215277777777778 | 414.035 |
| 0.6222222222222222 | 409.574 |
| 0.6229166666666667 | 400.638 |
| 0.6236111111111111 | 391.685 |
| 0.6243055555555556 | 387.202 |
| 0.625 | 378.224 |
| 0.6256944444444444 | 369.23 |
| 0.6263888888888889 | 360.221 |
| 0.6270833333333333 | 355.712 |
| 0.6277777777777778 | 346.682 |
| 0.6284722222222222 | 342.162 |
| 0.6291666666666667 | 337.639 |
| 0.6298611111111111 | 333.113 |
| 0.6305555555555555 | 328.584 |
| 0.63125 | 324.052 |
| 0.6319444444444444 | 319.517 |
| 0.6326388888888889 | 314.98 |
| 0.6333333333333333 | 310.44 |
| 0.6340277777777777 | 301.354 |
| 0.6347222222222222 | 296.808 |
| 0.6354166666666666 | 296.808 |
| 0.6361111111111112 | 292.259 |
| 0.6368055555555555 | 287.709 |
| 0.6375000000000001 | 287.709 |
| 0.6381944444444444 | 283.156 |
| 0.638888888888889 | 278.603 |
| 0.6395833333333333 | 274.047 |
| 0.6402777777777778 | 269.49 |
| 0.6409722222222222 | 264.932 |
| 0.6416666666666667 | 260.373 |
| 0.642361111111111 | 255.813 |
| 0.6430555555555556 | 251.251 |
| 0.6437499999999999 | 246.689 |
| 0.6444444444444445 | 242.127 |
| 0.6451388888888888 | 237.564 |
| 0.6458333333333334 | 237.564 |
| 0.6465277777777778 | 233 |
| 0.6472222222222223 | 228.436 |
| 0.6479166666666667 | 223.873 |
| 0.6486111111111111 | 223.873 |
| 0.6493055555555556 | 219.309 |
| 0.65 | 214.746 |
| 0.6506944444444445 | 210.182 |
| 0.6513888888888889 | 210.182 |
| 0.6520833333333333 | 205.62 |
| 0.6527777777777778 | 201.058 |
| 0.6534722222222222 | 201.058 |
| 0.6541666666666667 | 201.058 |
| 0.6548611111111111 | 196.497 |
| 0.6555555555555556 | 191.937 |
| 0.65625 | 191.937 |
| 0.6569444444444444 | 187.378 |
| 0.6576388888888889 | 187.378 |
| 0.6583333333333333 | 182.82 |
| 0.6590277777777778 | 182.82 |
| 0.6597222222222222 | 182.82 |
| 0.6604166666666667 | 178.264 |
| 0.6611111111111111 | 178.264 |
| 0.6618055555555555 | 173.709 |
| 0.6625 | 173.709 |
| 0.6631944444444444 | 173.709 |
| 0.6638888888888889 | 169.156 |
| 0.6645833333333333 | 169.156 |
| 0.6652777777777777 | 164.605 |
| 0.6659722222222222 | 164.605 |
| 0.6666666666666666 | 164.605 |
| 0.6673611111111111 | 160.056 |
| 0.6680555555555556 | 160.056 |
| 0.6687500000000001 | 155.509 |
| 0.6694444444444444 | 155.509 |
| 0.6701388888888888 | 155.509 |
| 0.6708333333333334 | 150.964 |
| 0.6715277777777778 | 150.964 |
| 0.6722222222222222 | 146.423 |
| 0.6729166666666666 | 146.423 |
| 0.6736111111111112 | 146.423 |
| 0.6743055555555556 | 146.423 |
| 0.6749999999999999 | 141.884 |
| 0.6756944444444444 | 141.884 |
| 0.6763888888888889 | 141.884 |
| 0.6770833333333334 | 137.347 |
| 0.6777777777777777 | 132.814 |
| 0.6784722222222223 | 123.758 |
| 0.6791666666666667 | 119.235 |
| 0.6798611111111111 | 119.235 |
| 0.6805555555555555 | 114.716 |
| 0.68125 | 114.716 |
| 0.6819444444444445 | 114.716 |
| 0.6826388888888889 | 114.716 |
| 0.6833333333333332 | 110.201 |
| 0.6840277777777778 | 110.201 |
| 0.6847222222222222 | 110.201 |
| 0.6854166666666667 | 110.201 |
| 0.686111111111111 | 110.201 |
| 0.6868055555555556 | 110.201 |
| 0.6875 | 105.69 |
| 0.6881944444444444 | 105.69 |
| 0.688888888888889 | 105.69 |
| 0.6895833333333333 | 105.69 |
| 0.6902777777777778 | 101.184 |
| 0.6909722222222222 | 101.184 |
| 0.6916666666666668 | 101.184 |
| 0.6923611111111111 | 101.184 |
| 0.6930555555555555 | 101.184 |
| 0.69375 | 101.184 |
| 0.6944444444444445 | 96.682 |
| 0.6951388888888889 | 96.682 |
| 0.6958333333333333 | 96.682 |
| 0.6965277777777777 | 92.184 |
| 0.6972222222222223 | 92.184 |
| 0.6979166666666666 | 92.184 |
| 0.6986111111111111 | 92.184 |
| 0.6993055555555556 | 87.692 |
| 0.7000000000000001 | 87.692 |
| 0.7006944444444444 | 87.692 |
| 0.7013888888888888 | 87.692 |
| 0.7020833333333334 | 83.205 |
| 0.7027777777777778 | 83.205 |
| 0.7034722222222222 | 83.205 |
| 0.7041666666666666 | 78.722 |
| 0.7048611111111112 | 78.722 |
| 0.7055555555555556 | 78.722 |
| 0.7062499999999999 | 78.722 |
| 0.7069444444444444 | 74.246 |
| 0.7076388888888889 | 74.246 |
| 0.7083333333333334 | 74.246 |
| 0.7090277777777777 | 74.246 |
| 0.7097222222222223 | 69.775 |
| 0.7104166666666667 | 69.775 |
| 0.7111111111111111 | 69.775 |
| 0.7118055555555555 | 65.31 |
| 0.7125 | 65.31 |
| 0.7131944444444445 | 65.31 |
| 0.7138888888888889 | 60.85 |
| 0.7145833333333332 | 60.85 |
| 0.7152777777777778 | 60.85 |
| 0.7159722222222222 | 56.398 |
| 0.7166666666666667 | 56.398 |
| 0.717361111111111 | 56.398 |
| 0.7180555555555556 | 56.398 |
| 0.71875 | 51.951 |
| 0.7194444444444444 | 51.951 |
| 0.720138888888889 | 51.951 |
| 0.7208333333333333 | 47.511 |
| 0.7215277777777778 | 47.511 |
| 0.7222222222222222 | 47.511 |
| 0.7229166666666668 | 43.079 |
| 0.7236111111111111 | 43.079 |
| 0.7243055555555555 | 43.079 |
| 0.725 | 43.079 |
| 0.7256944444444445 | 38.653 |
| 0.7263888888888889 | 38.653 |
| 0.7270833333333333 | 38.653 |
| 0.7277777777777777 | 38.653 |
| 0.7284722222222223 | 34.234 |
| 0.7291666666666666 | 34.234 |
| 0.7298611111111111 | 34.234 |
| 0.7305555555555556 | 34.234 |
| 0.7312500000000001 | 29.823 |
| 0.7319444444444444 | 29.823 |
| 0.7326388888888888 | 29.823 |
| 0.7333333333333334 | 25.419 |
| 0.7340277777777778 | 25.419 |
| 0.7347222222222222 | 25.419 |
| 0.7354166666666666 | 25.419 |
| 0.7361111111111112 | 21.024 |
| 0.7368055555555556 | 21.024 |
| 0.7374999999999999 | 21.024 |
| 0.7381944444444444 | 21.024 |
| 0.7388888888888889 | 21.024 |
| 0.7395833333333334 | 16.636 |
| 0.7402777777777777 | 16.636 |
| 0.7409722222222223 | 16.636 |
| 0.7416666666666667 | 16.636 |
| 0.7423611111111111 | 12.257 |
| 0.7430555555555555 | 12.257 |
| 0.74375 | 12.257 |
| 0.7444444444444445 | 12.257 |
| 0.7451388888888889 | 12.257 |
| 0.7458333333333332 | 7.887 |
| 0.7465277777777778 | 7.887 |
| 0.7472222222222222 | 7.887 |
| 0.7479166666666667 | 7.887 |
| 0.748611111111111 | 3.525 |
| 0.7493055555555556 | 3.525 |
| 0.75 | 3.525 |
| 0.7506944444444444 | 3.525 |
| 0.751388888888889 | 3.525 |
| 0.7520833333333333 | 3.525 |
| 0.7527777777777778 | 3.525 |
| 0.7534722222222222 | 0 |
| 0.7541666666666668 | 0 |
| 0.7548611111111111 | 0 |
| 0.7555555555555555 | 0 |
| 0.75625 | 0 |
| 0.7569444444444445 | 0 |
| 0.7576388888888889 | 0 |
| 0.7583333333333333 | 0 |
| 0.7590277777777777 | 0 |
| 0.7597222222222223 | 0 |
| 0.7604166666666666 | 0 |
| 0.7611111111111111 | 0 |
| 0.7618055555555556 | 0 |
| 0.7625000000000001 | 0 |
| 0.7631944444444444 | 0 |
| 0.7638888888888888 | 0 |
| 0.7645833333333334 | 0 |
| 0.7652777777777778 | 0 |
| 0.7659722222222222 | 0 |
| 0.7666666666666666 | 0 |
| 0.7673611111111112 | 0 |
| 0.7680555555555556 | 0 |
| 0.7687499999999999 | 0 |
| 0.7694444444444444 | 0 |
| 0.7701388888888889 | 0 |
| 0.7708333333333334 | 0 |
| 0.7715277777777777 | 0 |
| 0.7722222222222223 | 0 |
| 0.7729166666666667 | 0 |
| 0.7736111111111111 | 0 |
| 0.7743055555555555 | 0 |
| 0.775 | 0 |
| 0.7756944444444445 | 0 |
| 0.7763888888888889 | 0 |
| 0.7770833333333332 | 0 |
| 0.7777777777777778 | 0 |
| 0.7784722222222222 | 0 |
| 0.7791666666666667 | 0 |
| 0.779861111111111 | 0 |
| 0.7805555555555556 | 0 |
| 0.78125 | 0 |
| 0.7819444444444444 | 0 |
| 0.782638888888889 | 0 |
| 0.7833333333333333 | 0 |
| 0.7840277777777778 | 0 |
| 0.7847222222222222 | 0 |
| 0.7854166666666668 | 0 |
| 0.7861111111111111 | 0 |
| 0.7868055555555555 | 0 |
| 0.7875 | 0 |
| 0.7881944444444445 | 0 |
| 0.7888888888888889 | 0 |
| 0.7895833333333333 | 0 |
| 0.7902777777777777 | 0 |
| 0.7909722222222223 | 0 |
| 0.7916666666666666 | 0 |
| 0.7923611111111111 | 0 |
| 0.7930555555555556 | 0 |
| 0.7937500000000001 | 0 |
| 0.7944444444444444 | 0 |
| 0.7951388888888888 | 0 |
| 0.7958333333333334 | 0 |
| 0.7965277777777778 | 0 |
| 0.7972222222222222 | 0 |
| 0.7979166666666666 | 0 |
| 0.7986111111111112 | 0 |
| 0.7993055555555556 | 0 |
| 0.7999999999999999 | 0 |
| 0.8006944444444444 | 0 |
| 0.8013888888888889 | 0 |
| 0.8020833333333334 | 0 |
| 0.8027777777777777 | 0 |
| 0.8034722222222223 | 0 |
| 0.8041666666666667 | 0 |
| 0.8048611111111111 | 0 |
| 0.8055555555555555 | 0 |
| 0.80625 | 0 |
| 0.8069444444444445 | 0 |
| 0.8076388888888889 | 0 |
| 0.8083333333333332 | 0 |
| 0.8090277777777778 | 0 |
| 0.8097222222222222 | 0 |
| 0.8104166666666667 | 0 |
| 0.811111111111111 | 0 |
| 0.8118055555555556 | 0 |
| 0.8125 | 0 |
| 0.8131944444444444 | 0 |
| 0.813888888888889 | 0 |
| 0.8145833333333333 | 0 |
| 0.8152777777777778 | 0 |
| 0.8159722222222222 | 0 |
| 0.8166666666666668 | 0 |
| 0.8173611111111111 | 0 |
| 0.8180555555555555 | 0 |
| 0.81875 | 0 |
| 0.8194444444444445 | 0 |
| 0.8201388888888889 | 0 |
| 0.8208333333333333 | 0 |
| 0.8215277777777777 | 0 |
| 0.8222222222222223 | 0 |
| 0.8229166666666666 | 0 |
| 0.8236111111111111 | 0 |
| 0.8243055555555556 | 0 |
| 0.8250000000000001 | 0 |
| 0.8256944444444444 | 0 |
| 0.8263888888888888 | 0 |
| 0.8270833333333334 | 0 |
| 0.8277777777777778 | 0 |
| 0.8284722222222222 | 0 |
| 0.8291666666666666 | 0 |
| 0.8298611111111112 | 0 |
| 0.8305555555555556 | 0 |
| 0.8312499999999999 | 0 |
| 0.8319444444444444 | 0 |
| 0.8326388888888889 | 0 |
| 0.8333333333333334 | 0 |
| 0.8340277777777777 | 0 |
| 0.8347222222222223 | 0 |
| 0.8354166666666667 | 0 |
| 0.8361111111111111 | 0 |
| 0.8368055555555555 | 0 |
| 0.8375 | 0 |
| 0.8381944444444445 | 0 |
| 0.8388888888888889 | 0 |
| 0.8395833333333332 | 0 |
| 0.8402777777777778 | 0 |
| 0.8409722222222222 | 0 |
| 0.8416666666666667 | 0 |
| 0.842361111111111 | 0 |
| 0.8430555555555556 | 0 |
| 0.84375 | 0 |
| 0.8444444444444444 | 0 |
| 0.845138888888889 | 0 |
| 0.8458333333333333 | 0 |
| 0.8465277777777778 | 0 |
| 0.8472222222222222 | 0 |
| 0.8479166666666668 | 0 |
| 0.8486111111111111 | 0 |
| 0.8493055555555555 | 0 |
| 0.85 | 0 |
| 0.8506944444444445 | 0 |
| 0.8513888888888889 | 0 |
| 0.8520833333333333 | 0 |
| 0.8527777777777777 | 0 |
| 0.8534722222222223 | 0 |
| 0.8541666666666666 | 0 |
| 0.8548611111111111 | 0 |
| 0.8555555555555556 | 0 |
| 0.8562500000000001 | 0 |
| 0.8569444444444444 | 0 |
| 0.8576388888888888 | 0 |
| 0.8583333333333334 | 0 |
| 0.8590277777777778 | 0 |
| 0.8597222222222222 | 0 |
| 0.8604166666666666 | 0 |
| 0.8611111111111112 | 0 |
| 0.8618055555555556 | 0 |
| 0.8624999999999999 | 0 |
| 0.8631944444444444 | 0 |
| 0.8638888888888889 | 0 |
| 0.8645833333333334 | 0 |
| 0.8652777777777777 | 0 |
| 0.8659722222222223 | 0 |
| 0.8666666666666667 | 0 |
| 0.8673611111111111 | 0 |
| 0.8680555555555555 | 0 |
| 0.86875 | 0 |
| 0.8694444444444445 | 0 |
| 0.8701388888888889 | 0 |
| 0.8708333333333332 | 0 |
| 0.8715277777777778 | 0 |
| 0.8722222222222222 | 0 |
| 0.8729166666666667 | 0 |
| 0.873611111111111 | 0 |
| 0.8743055555555556 | 0 |
| 0.875 | 0 |
| 0.8756944444444444 | 0 |
| 0.876388888888889 | 0 |
| 0.8770833333333333 | 0 |
| 0.8777777777777778 | 0 |
| 0.8784722222222222 | 0 |
| 0.8791666666666668 | 0 |
| 0.8798611111111111 | 0 |
| 0.8805555555555555 | 0 |
| 0.88125 | 0 |
| 0.8819444444444445 | 0 |
| 0.8826388888888889 | 0 |
| 0.8833333333333333 | 0 |
| 0.8840277777777777 | 0 |
| 0.8847222222222223 | 0 |
| 0.8854166666666666 | 0 |
| 0.8861111111111111 | 0 |
| 0.8868055555555556 | 0 |
| 0.8875000000000001 | 0 |
| 0.8881944444444444 | 0 |
| 0.8888888888888888 | 0 |
| 0.8895833333333334 | 0 |
| 0.8902777777777778 | 0 |
| 0.8909722222222222 | 0 |
| 0.8916666666666666 | 0 |
| 0.8923611111111112 | 0 |
| 0.8930555555555556 | 0 |
| 0.8937499999999999 | 0 |
| 0.8944444444444444 | 0 |
| 0.8951388888888889 | 0 |
| 0.8958333333333334 | 0 |
| 0.8965277777777777 | 0 |
| 0.8972222222222223 | 0 |
| 0.8979166666666667 | 0 |
| 0.8986111111111111 | 0 |
| 0.8993055555555555 | 0 |
| 0.9 | 0 |
| 0.9006944444444445 | 0 |
| 0.9013888888888889 | 0 |
| 0.9020833333333332 | 0 |
| 0.9027777777777778 | 0 |
| 0.9034722222222222 | 0 |
| 0.9041666666666667 | 0 |
| 0.904861111111111 | 0 |
| 0.9055555555555556 | 0 |
| 0.90625 | 0 |
| 0.9069444444444444 | 0 |
| 0.907638888888889 | 0 |
| 0.9083333333333333 | 0 |
| 0.9090277777777778 | 0 |
| 0.9097222222222222 | 0 |
| 0.9104166666666668 | 0 |
| 0.9111111111111111 | 0 |
| 0.9118055555555555 | 0 |
| 0.9125 | 0 |
| 0.9131944444444445 | 0 |
| 0.9138888888888889 | 0 |
| 0.9145833333333333 | 0 |
| 0.9152777777777777 | 0 |
| 0.9159722222222223 | 0 |
| 0.9166666666666666 | 0 |
| 0.9173611111111111 | 0 |
| 0.9180555555555556 | 0 |
| 0.9187500000000001 | 0 |
| 0.9194444444444444 | 0 |
| 0.9201388888888888 | 0 |
| 0.9208333333333334 | 0 |
| 0.9215277777777778 | 0 |
| 0.9222222222222222 | 0 |
| 0.9229166666666666 | 0 |
| 0.9236111111111112 | 0 |
| 0.9243055555555556 | 0 |
| 0.9249999999999999 | 0 |
| 0.9256944444444444 | 0 |
| 0.9263888888888889 | 0 |
| 0.9270833333333334 | 0 |
| 0.9277777777777777 | 0 |
| 0.9284722222222223 | 0 |
| 0.9291666666666667 | 0 |
| 0.9298611111111111 | 0 |
| 0.9305555555555555 | 0 |
| 0.93125 | 0 |
| 0.9319444444444445 | 0 |
| 0.9326388888888889 | 0 |
| 0.9333333333333332 | 0 |
| 0.9340277777777778 | 0 |
| 0.9347222222222222 | 0 |
| 0.9354166666666667 | 0 |
| 0.936111111111111 | 0 |
| 0.9368055555555556 | 0 |
| 0.9375 | 0 |
| 0.9381944444444444 | 0 |
| 0.938888888888889 | 0 |
| 0.9395833333333333 | 0 |
| 0.9402777777777778 | 0 |
| 0.9409722222222222 | 0 |
| 0.9416666666666668 | 0 |
| 0.9423611111111111 | 0 |
| 0.9430555555555555 | 0 |
| 0.94375 | 0 |
| 0.9444444444444445 | 0 |
| 0.9451388888888889 | 0 |
| 0.9458333333333333 | 0 |
| 0.9465277777777777 | 0 |
| 0.9472222222222223 | 0 |
| 0.9479166666666666 | 0 |
| 0.9486111111111111 | 0 |
| 0.9493055555555556 | 0 |
| 0.9500000000000001 | 0 |
| 0.9506944444444444 | 0 |
| 0.9513888888888888 | 0 |
| 0.9520833333333334 | 0 |
| 0.9527777777777778 | 0 |
| 0.9534722222222222 | 0 |
| 0.9541666666666666 | 0 |
| 0.9548611111111112 | 0 |
| 0.9555555555555556 | 0 |
| 0.9562499999999999 | 0 |
| 0.9569444444444444 | 0 |
| 0.9576388888888889 | 0 |
| 0.9583333333333334 | 0 |
| 0.9590277777777777 | 0 |
| 0.9597222222222223 | 0 |
| 0.9604166666666667 | 0 |
| 0.9611111111111111 | 0 |
| 0.9618055555555555 | 0 |
| 0.9625 | 0 |
| 0.9631944444444445 | 0 |
| 0.9638888888888889 | 0 |
| 0.9645833333333332 | 0 |
| 0.9652777777777778 | 0 |
| 0.9659722222222222 | 0 |
| 0.9666666666666667 | 0 |
| 0.967361111111111 | 0 |
| 0.9680555555555556 | 0 |
| 0.96875 | 0 |
| 0.9694444444444444 | 0 |
| 0.970138888888889 | 0 |
| 0.9708333333333333 | 0 |
| 0.9715277777777778 | 0 |
| 0.9722222222222222 | 0 |
| 0.9729166666666668 | 0 |
| 0.9736111111111111 | 0 |
| 0.9743055555555555 | 0 |
| 0.975 | 0 |
| 0.9756944444444445 | 0 |
| 0.9763888888888889 | 0 |
| 0.9770833333333333 | 0 |
| 0.9777777777777777 | 0 |
| 0.9784722222222223 | 0 |
| 0.9791666666666666 | 0 |
| 0.9798611111111111 | 0 |
| 0.9805555555555556 | 0 |
| 0.9812500000000001 | 0 |
| 0.9819444444444444 | 0 |
| 0.9826388888888888 | 0 |
| 0.9833333333333334 | 0 |
| 0.9840277777777778 | 0 |
| 0.9847222222222222 | 0 |
| 0.9854166666666666 | 0 |
| 0.9861111111111112 | 0 |
| 0.9868055555555556 | 0 |
| 0.9874999999999999 | 0 |
| 0.9881944444444444 | 0 |
| 0.9888888888888889 | 0 |
| 0.9895833333333334 | 0 |
| 0.9902777777777777 | 0 |
| 0.9909722222222223 | 0 |
| 0.9916666666666667 | 0 |
| 0.9923611111111111 | 0 |
| 0.9930555555555555 | 0 |
| 0.99375 | 0 |
| 0.9944444444444445 | 0 |
| 0.9951388888888889 | 0 |
| 0.9958333333333332 | 0 |
| 0.9965277777777778 | 0 |
| 0.9972222222222222 | 0 |
| 0.9979166666666667 | 0 |
| 0.998611111111111 | 0 |
| 0.9993055555555556 | 0 |